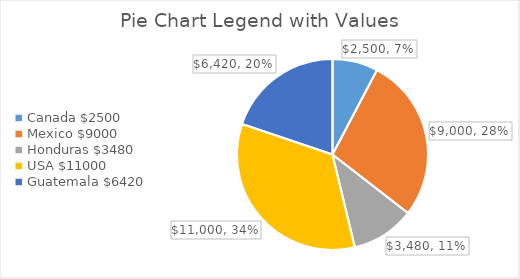
| Category | Sales |
|---|---|
| Canada $2500 | 2500 |
| Mexico $9000 | 9000 |
| Honduras $3480 | 3480 |
| USA $11000 | 11000 |
| Guatemala $6420 | 6420 |